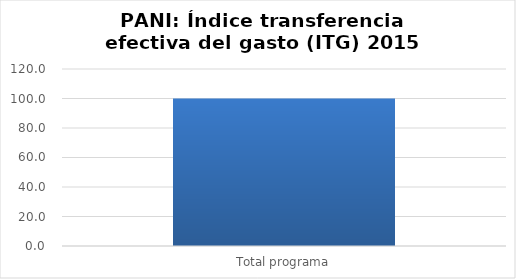
| Category | Índice transferencia efectiva del gasto (ITG) |
|---|---|
| Total programa | 100 |